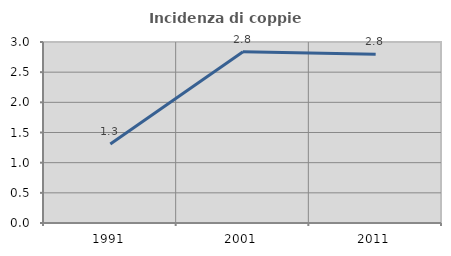
| Category | Incidenza di coppie miste |
|---|---|
| 1991.0 | 1.31 |
| 2001.0 | 2.837 |
| 2011.0 | 2.795 |